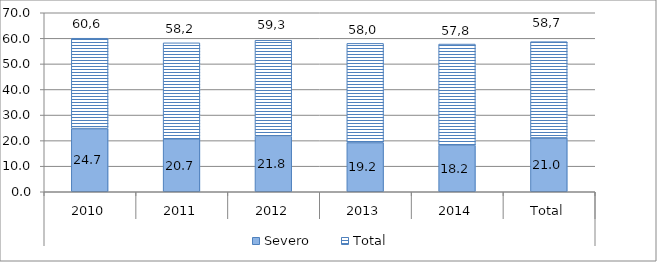
| Category | Severo | Total |
|---|---|---|
| 0 | 24.702 | 35.334 |
| 1 | 20.723 | 37.518 |
| 2 | 21.843 | 37.414 |
| 3 | 19.239 | 38.796 |
| 4 | 18.238 | 39.527 |
| 5 | 21.048 | 37.652 |